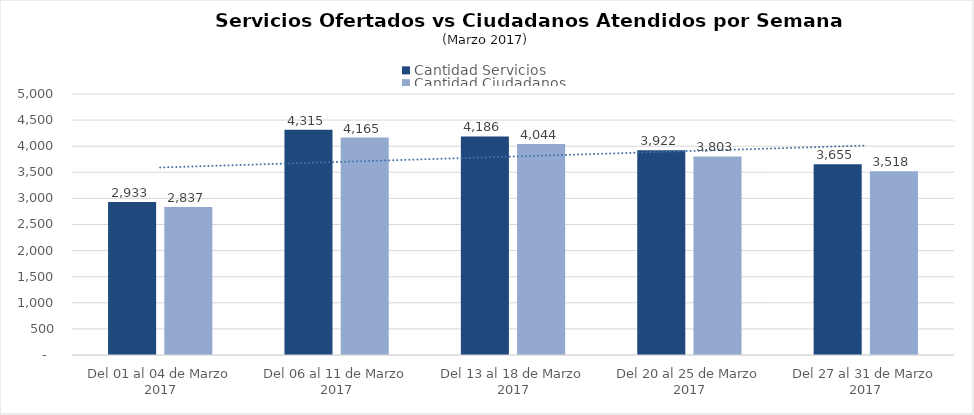
| Category | Cantidad Servicios | Cantidad Ciudadanos |
|---|---|---|
| Del 01 al 04 de Marzo 2017 | 2933 | 2837 |
| Del 06 al 11 de Marzo 2017 | 4315 | 4165 |
| Del 13 al 18 de Marzo 2017 | 4186 | 4044 |
| Del 20 al 25 de Marzo 2017 | 3922 | 3803 |
| Del 27 al 31 de Marzo 2017 | 3655 | 3518 |